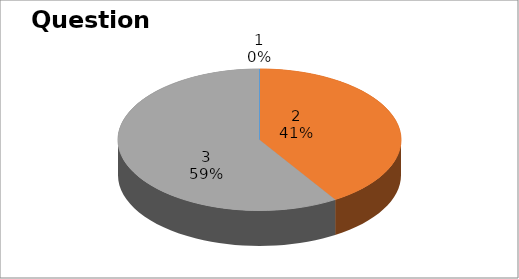
| Category | Series 0 |
|---|---|
| 0 | 0 |
| 1 | 16 |
| 2 | 23 |